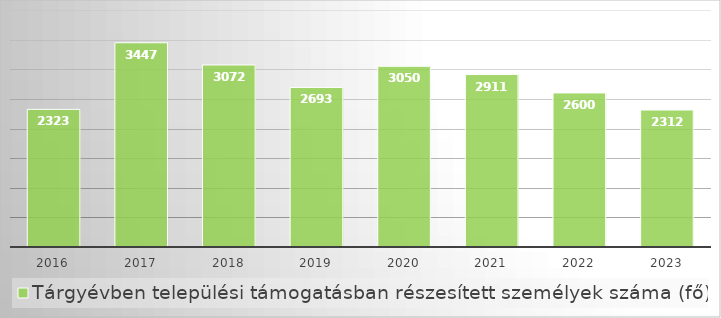
| Category | Tárgyévben települési támogatásban részesített személyek száma (fő) |
|---|---|
| 2016.0 | 2323 |
| 2017.0 | 3447 |
| 2018.0 | 3072 |
| 2019.0 | 2693 |
| 2020.0 | 3050 |
| 2021.0 | 2911 |
| 2022.0 | 2600 |
| 2023.0 | 2312 |